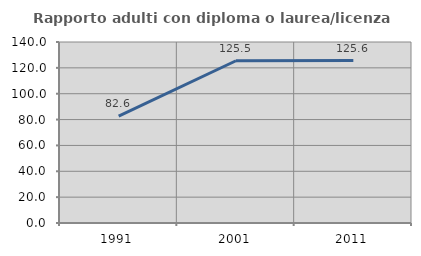
| Category | Rapporto adulti con diploma o laurea/licenza media  |
|---|---|
| 1991.0 | 82.609 |
| 2001.0 | 125.49 |
| 2011.0 | 125.6 |